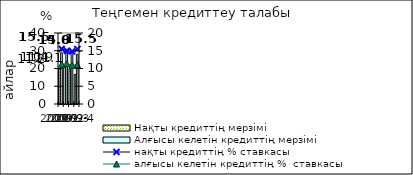
| Category | Нақты кредиттің мерзімі  | Алғысы келетін кредиттің мерзімі  |
|---|---|---|
| 2009-1 | 19.57 | 28.86 |
| 2009-2 | 20.49 | 28.69 |
| 2009-3 | 19.59 | 28.82 |
| 2009-4 | 16.65 | 27.94 |